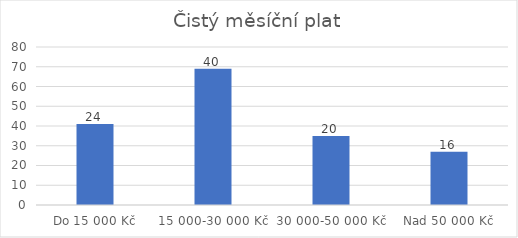
| Category | Počet respondentů |
|---|---|
| Do 15 000 Kč | 41 |
| 15 000-30 000 Kč | 69 |
| 30 000-50 000 Kč | 35 |
| Nad 50 000 Kč | 27 |